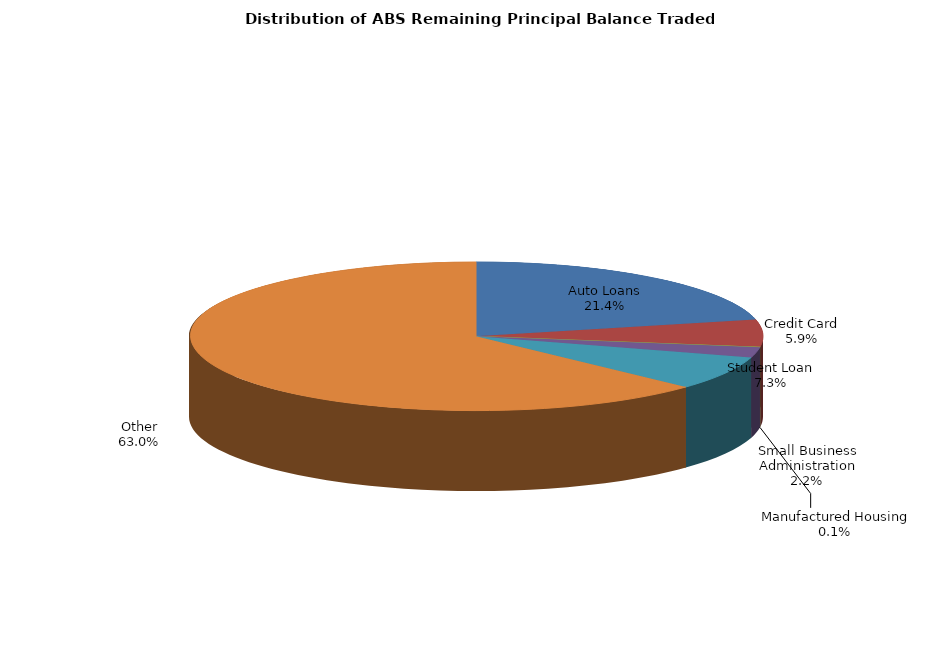
| Category | Series 0 |
|---|---|
| Auto Loans | 484140105.339 |
| Credit Card | 132773377.605 |
| Manufactured Housing | 3152226.258 |
| Small Business Administration | 50507525.547 |
| Student Loan | 166417418.65 |
| Other | 1428149570.994 |